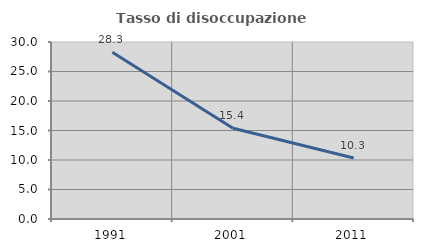
| Category | Tasso di disoccupazione giovanile  |
|---|---|
| 1991.0 | 28.276 |
| 2001.0 | 15.385 |
| 2011.0 | 10.345 |